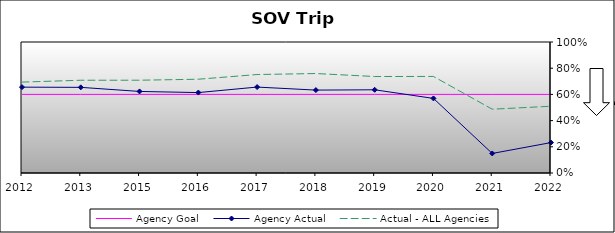
| Category | Agency Goal | Agency Actual | Actual - ALL Agencies |
|---|---|---|---|
| 2012.0 | 0.6 | 0.655 | 0.694 |
| 2013.0 | 0.6 | 0.654 | 0.708 |
| 2015.0 | 0.6 | 0.623 | 0.708 |
| 2016.0 | 0.6 | 0.614 | 0.716 |
| 2017.0 | 0.6 | 0.656 | 0.752 |
| 2018.0 | 0.6 | 0.633 | 0.759 |
| 2019.0 | 0.6 | 0.635 | 0.736 |
| 2020.0 | 0.6 | 0.57 | 0.737 |
| 2021.0 | 0.6 | 0.149 | 0.487 |
| 2022.0 | 0.6 | 0.232 | 0.509 |